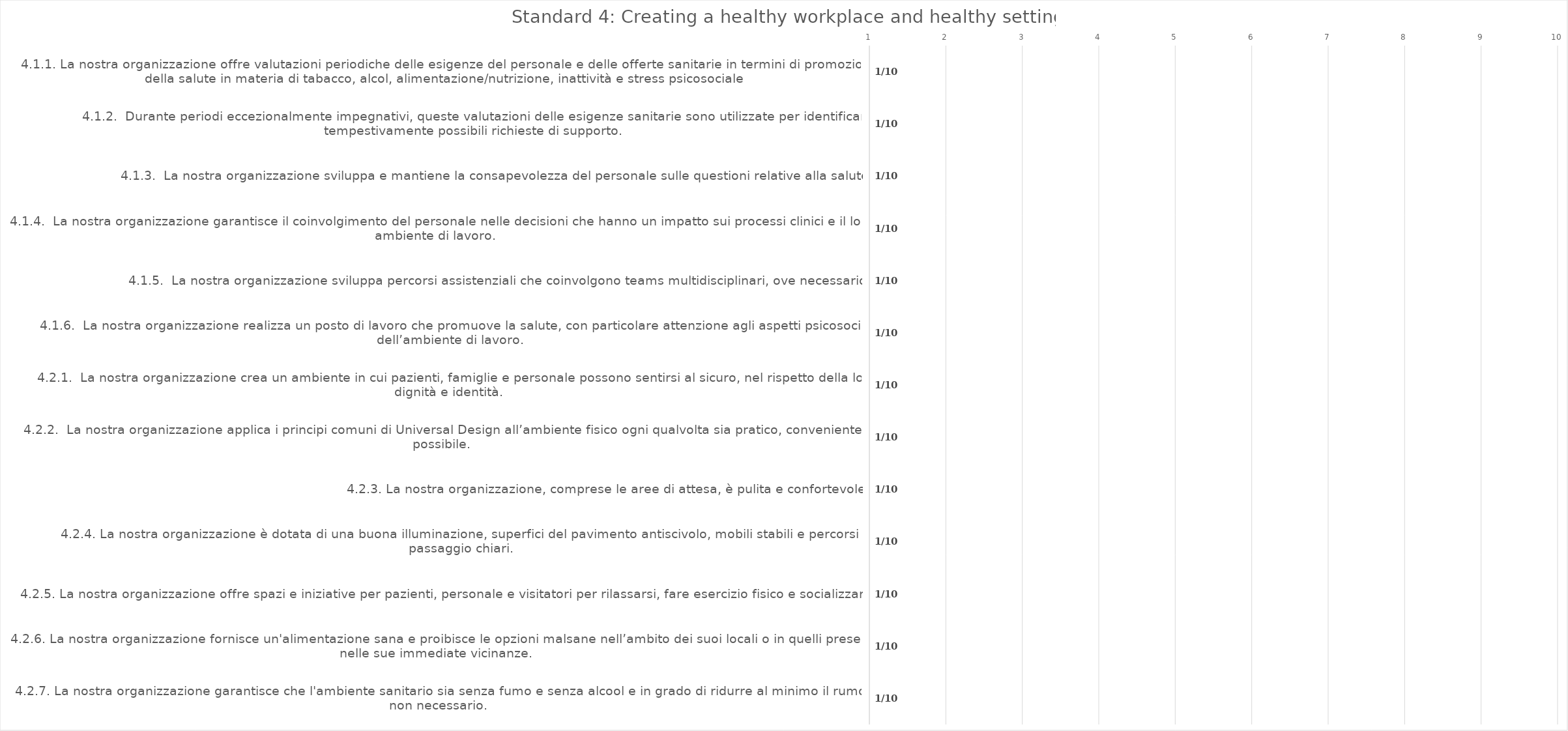
| Category | value |
|---|---|
| 4.1.1. La nostra organizzazione offre valutazioni periodiche delle esigenze del personale e delle offerte sanitarie in termini di promozione della salute in materia di tabacco, alcol, alimentazione/nutrizione, inattività e stress psicosociale | 1 |
| 4.1.2.  Durante periodi eccezionalmente impegnativi, queste valutazioni delle esigenze sanitarie sono utilizzate per identificare tempestivamente possibili richieste di supporto. | 1 |
| 4.1.3.  La nostra organizzazione sviluppa e mantiene la consapevolezza del personale sulle questioni relative alla salute. | 1 |
| 4.1.4.  La nostra organizzazione garantisce il coinvolgimento del personale nelle decisioni che hanno un impatto sui processi clinici e il loro ambiente di lavoro. | 1 |
| 4.1.5.  La nostra organizzazione sviluppa percorsi assistenziali che coinvolgono teams multidisciplinari, ove necessario. | 1 |
| 4.1.6.  La nostra organizzazione realizza un posto di lavoro che promuove la salute, con particolare attenzione agli aspetti psicosociali dell’ambiente di lavoro. | 1 |
| 4.2.1.  La nostra organizzazione crea un ambiente in cui pazienti, famiglie e personale possono sentirsi al sicuro, nel rispetto della loro dignità e identità. | 1 |
| 4.2.2.  La nostra organizzazione applica i principi comuni di Universal Design all’ambiente fisico ogni qualvolta sia pratico, conveniente e possibile. | 1 |
| 4.2.3. La nostra organizzazione, comprese le aree di attesa, è pulita e confortevole. | 1 |
| 4.2.4. La nostra organizzazione è dotata di una buona illuminazione, superfici del pavimento antiscivolo, mobili stabili e percorsi di passaggio chiari. | 1 |
| 4.2.5. La nostra organizzazione offre spazi e iniziative per pazienti, personale e visitatori per rilassarsi, fare esercizio fisico e socializzare. | 1 |
| 4.2.6. La nostra organizzazione fornisce un'alimentazione sana e proibisce le opzioni malsane nell’ambito dei suoi locali o in quelli presenti nelle sue immediate vicinanze. | 1 |
| 4.2.7. La nostra organizzazione garantisce che l'ambiente sanitario sia senza fumo e senza alcool e in grado di ridurre al minimo il rumore non necessario. | 1 |